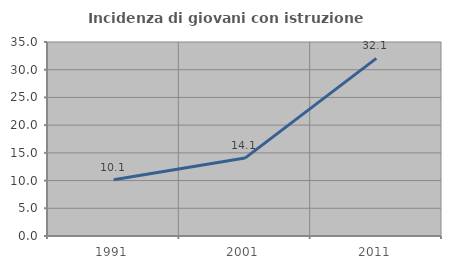
| Category | Incidenza di giovani con istruzione universitaria |
|---|---|
| 1991.0 | 10.129 |
| 2001.0 | 14.055 |
| 2011.0 | 32.051 |